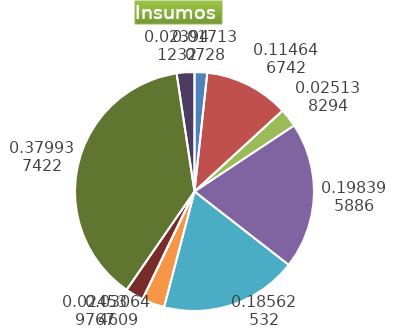
| Category | Series 0 |
|---|---|
| Control arvenses | 1661140 |
| Control fitosanitario | 11117116 |
| Cosecha y beneficio | 2437621.168 |
| Fertilización | 19238140 |
| Instalación | 17999798.179 |
| Otros | 2971560 |
| Podas | 0 |
| Riego | 2379583 |
| Transporte | 36841940 |
| Tutorado | 2321544 |